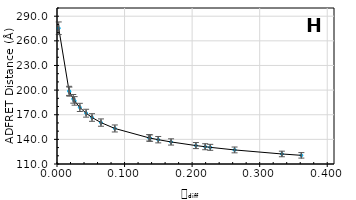
| Category | distance |
|---|---|
| 0.36170917111111045 | 120.548 |
| 0.33283306000000046 | 122.231 |
| 0.2628330600000002 | 127.137 |
| 0.22683306000000059 | 130.297 |
| 0.2193330600000003 | 131.03 |
| 0.20558306000000037 | 132.451 |
| 0.16883305999999987 | 136.871 |
| 0.14983306000000063 | 139.621 |
| 0.13783306000000017 | 141.578 |
| 0.13633306000000012 | 141.836 |
| 0.08558306000000027 | 153.281 |
| 0.06508306000000008 | 160.438 |
| 0.051833060000000764 | 166.642 |
| 0.04308306000000073 | 171.858 |
| 0.03383306000000008 | 178.922 |
| 0.02608306000000038 | 186.85 |
| 0.024083059999999712 | 189.351 |
| 0.018333060000000678 | 198.159 |
| 0.017833060000000067 | 199.074 |
| 0.0025473457142854983 | 275.342 |